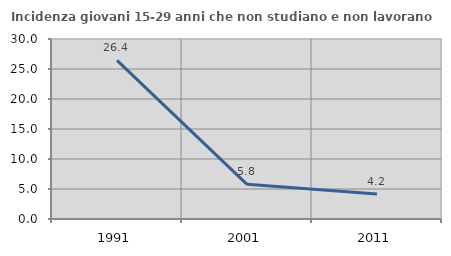
| Category | Incidenza giovani 15-29 anni che non studiano e non lavorano  |
|---|---|
| 1991.0 | 26.437 |
| 2001.0 | 5.778 |
| 2011.0 | 4.175 |